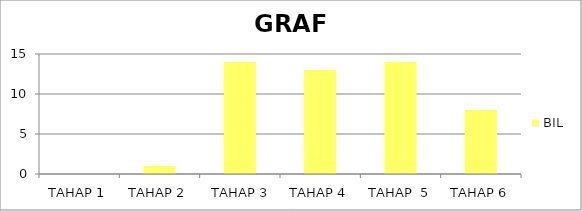
| Category | BIL |
|---|---|
| TAHAP 1 | 0 |
| TAHAP 2 | 1 |
|  TAHAP 3 | 14 |
| TAHAP 4 | 13 |
| TAHAP  5 | 14 |
| TAHAP 6 | 8 |